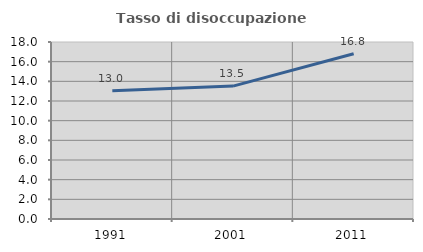
| Category | Tasso di disoccupazione giovanile  |
|---|---|
| 1991.0 | 13.041 |
| 2001.0 | 13.516 |
| 2011.0 | 16.804 |